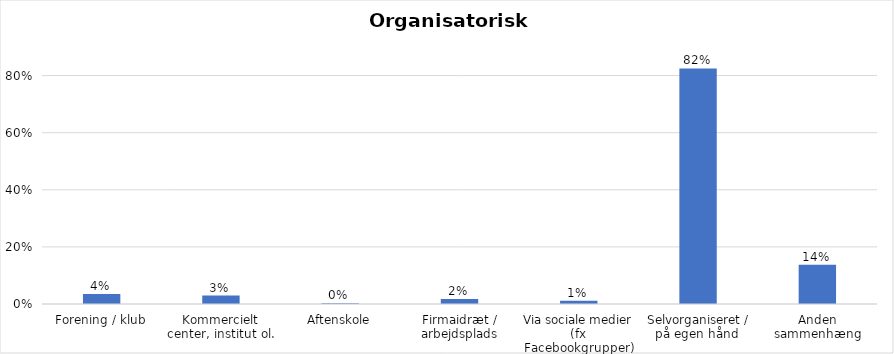
| Category | % |
|---|---|
| Forening / klub | 0.035 |
| Kommercielt center, institut ol. | 0.029 |
| Aftenskole | 0.003 |
| Firmaidræt / arbejdsplads | 0.017 |
| Via sociale medier (fx Facebookgrupper) | 0.011 |
| Selvorganiseret / på egen hånd  | 0.825 |
| Anden sammenhæng | 0.138 |